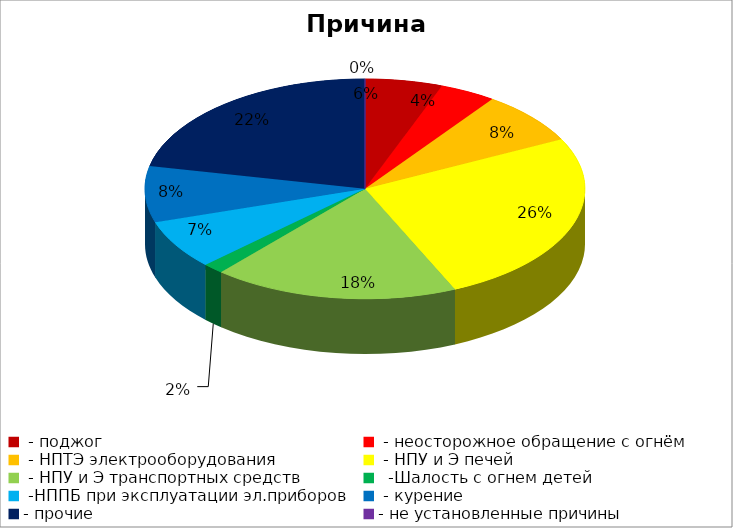
| Category | Причина пожара |
|---|---|
|  - поджог | 11 |
|  - неосторожное обращение с огнём | 8 |
|  - НПТЭ электрооборудования | 15 |
|  - НПУ и Э печей | 50 |
|  - НПУ и Э транспортных средств | 35 |
|   -Шалость с огнем детей | 3 |
|  -НППБ при эксплуатации эл.приборов | 14 |
|  - курение | 16 |
| - прочие | 42 |
| - не установленные причины | 0 |